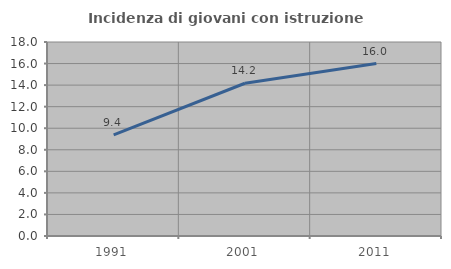
| Category | Incidenza di giovani con istruzione universitaria |
|---|---|
| 1991.0 | 9.375 |
| 2001.0 | 14.173 |
| 2011.0 | 16 |